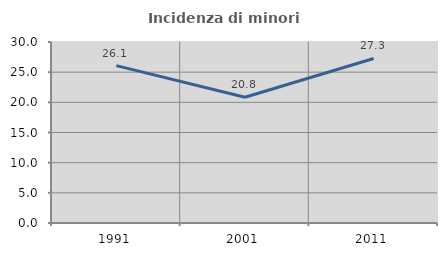
| Category | Incidenza di minori stranieri |
|---|---|
| 1991.0 | 26.087 |
| 2001.0 | 20.833 |
| 2011.0 | 27.273 |